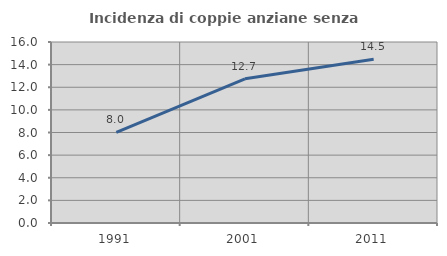
| Category | Incidenza di coppie anziane senza figli  |
|---|---|
| 1991.0 | 8.013 |
| 2001.0 | 12.748 |
| 2011.0 | 14.469 |